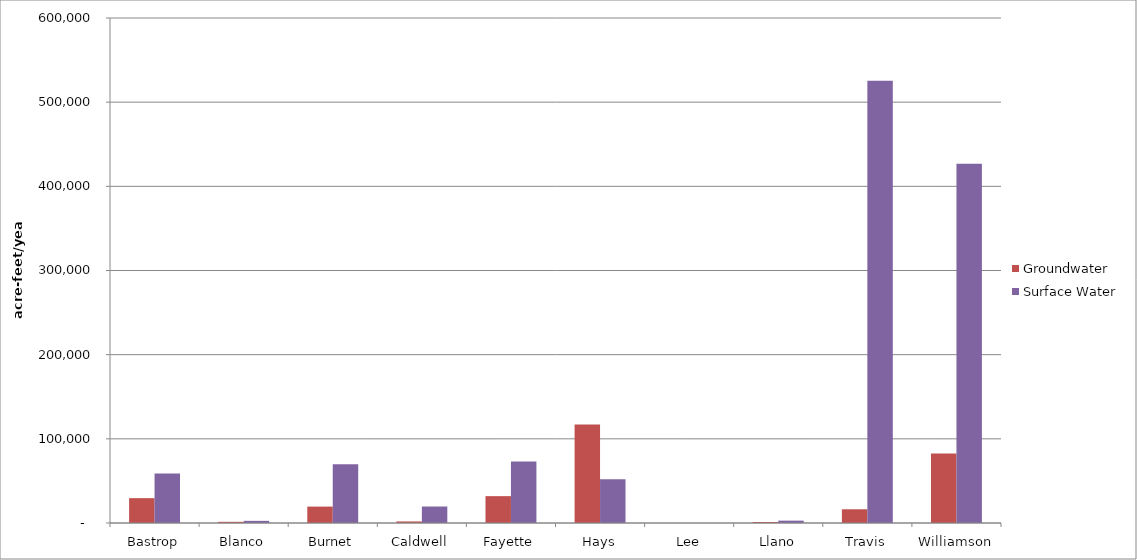
| Category | Groundwater | Surface Water |
|---|---|---|
| Bastrop | 29516 | 58916 |
| Blanco | 1380 | 2550 |
| Burnet | 19480 | 69734 |
| Caldwell | 1867 | 19576 |
| Fayette | 31908 | 73000 |
| Hays | 117131 | 52028 |
| Lee | 0 | 0 |
| Llano | 1200 | 2800 |
| Travis | 16300 | 525378 |
| Williamson | 82679 | 426883 |